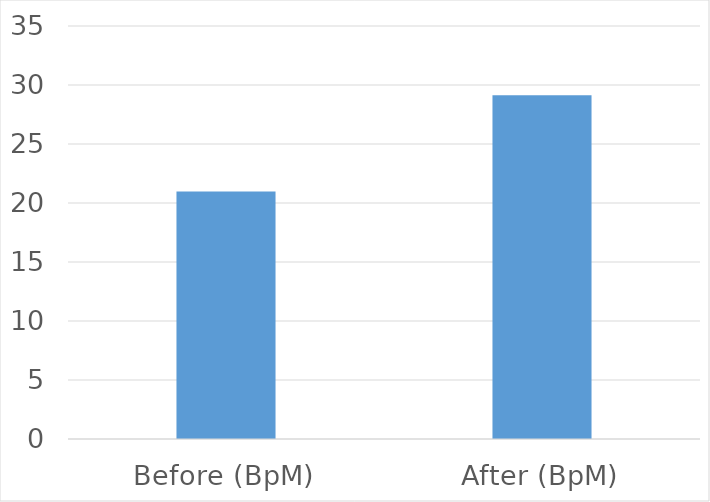
| Category | Series 0 |
|---|---|
| Before (BpM) | 20.967 |
| After (BpM) | 29.133 |